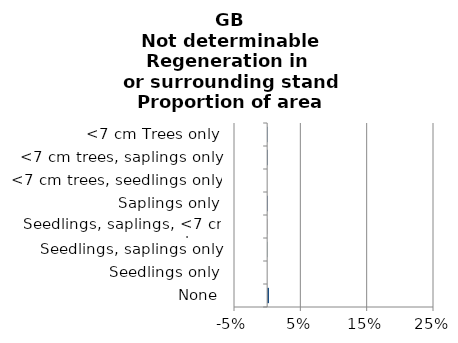
| Category | England | Scotland | Wales |
|---|---|---|---|
| None | 0 | 0.003 | 0 |
| Seedlings only | 0 | 0 | 0 |
| Seedlings, saplings only | 0 | 0 | 0 |
| Seedlings, saplings, <7 cm trees | 0 | 0 | 0 |
| Saplings only | 0 | 0.001 | 0 |
| <7 cm trees, seedlings only | 0 | 0 | 0 |
| <7 cm trees, saplings only | 0 | 0.001 | 0 |
| <7 cm Trees only | 0 | 0.001 | 0 |